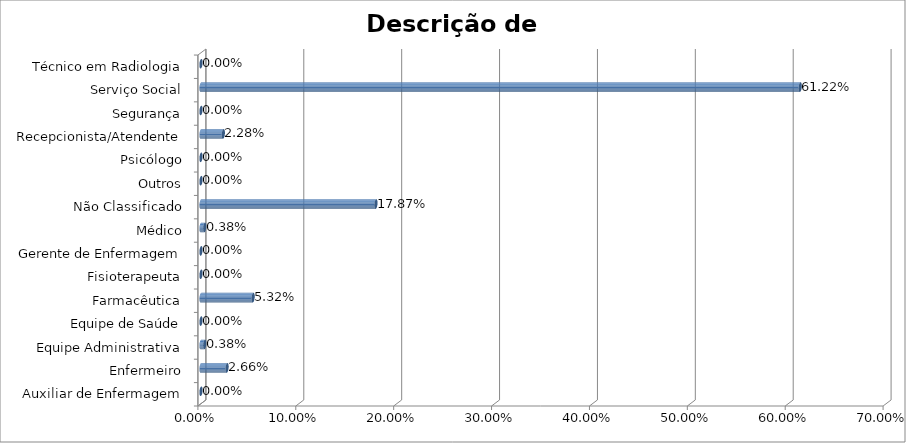
| Category | Series 0 |
|---|---|
| Auxiliar de Enfermagem | 0 |
| Enfermeiro | 0.027 |
| Equipe Administrativa | 0.004 |
| Equipe de Saúde | 0 |
| Farmacêutica | 0.053 |
| Fisioterapeuta | 0 |
| Gerente de Enfermagem | 0 |
| Médico | 0.004 |
| Não Classificado | 0.179 |
| Outros | 0 |
| Psicólogo | 0 |
| Recepcionista/Atendente | 0.023 |
| Segurança | 0 |
| Serviço Social | 0.612 |
| Técnico em Radiologia | 0 |